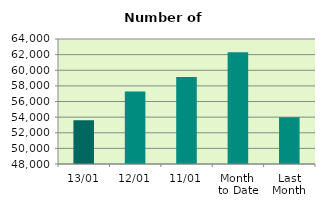
| Category | Series 0 |
|---|---|
| 13/01 | 53602 |
| 12/01 | 57282 |
| 11/01 | 59134 |
| Month 
to Date | 62298 |
| Last
Month | 53997.143 |